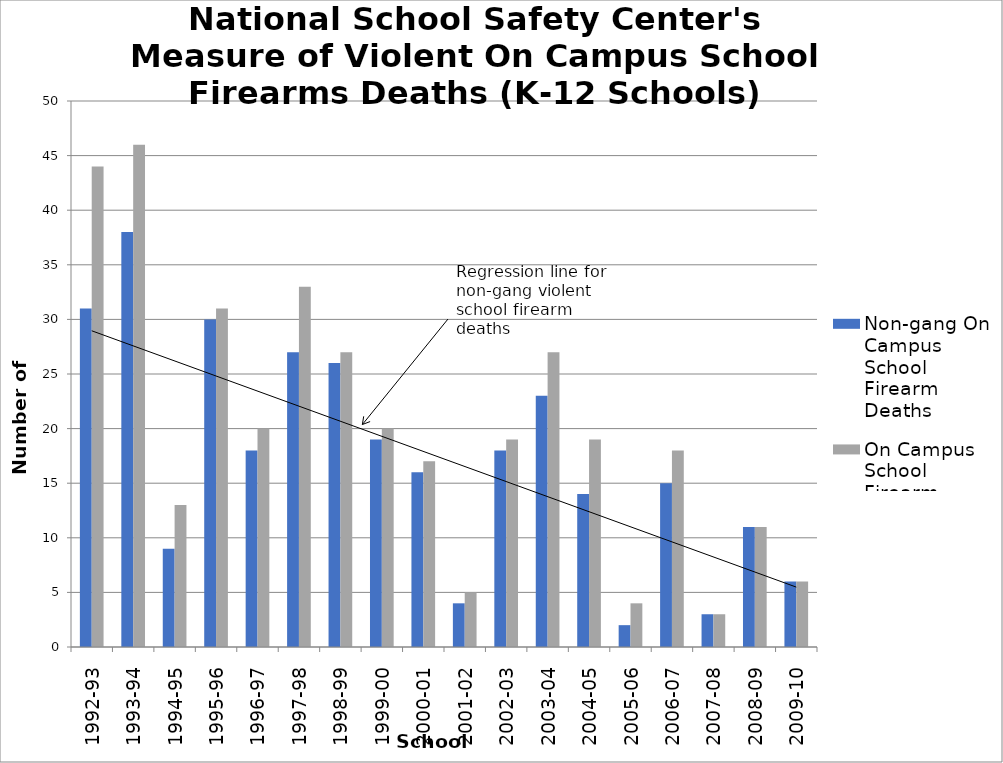
| Category | Non-gang On Campus School Firearm Deaths | On Campus School Firearm Deaths |
|---|---|---|
| 1992-93 | 31 | 44 |
| 1993-94 | 38 | 46 |
| 1994-95 | 9 | 13 |
| 1995-96 | 30 | 31 |
| 1996-97 | 18 | 20 |
| 1997-98 | 27 | 33 |
| 1998-99 | 26 | 27 |
| 1999-00 | 19 | 20 |
| 2000-01 | 16 | 17 |
| 2001-02 | 4 | 5 |
| 2002-03 | 18 | 19 |
| 2003-04 | 23 | 27 |
| 2004-05 | 14 | 19 |
| 2005-06 | 2 | 4 |
| 2006-07 | 15 | 18 |
| 2007-08 | 3 | 3 |
| 2008-09 | 11 | 11 |
| 2009-10 | 6 | 6 |